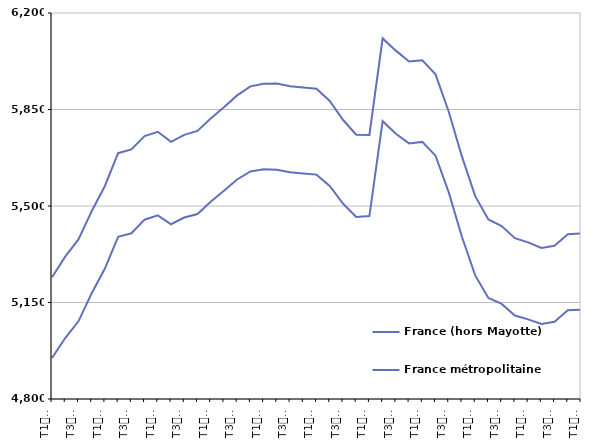
| Category | France (hors Mayotte) | France métropolitaine |
|---|---|---|
| T1
2014 | 5241.8 | 4948.5 |
| T2
2014 | 5316.2 | 5021 |
| T3
2014 | 5378.7 | 5081.8 |
| T4
2014 | 5481.1 | 5183.3 |
| T1
2015 | 5572.6 | 5273 |
| T2
2015 | 5691.5 | 5387.9 |
| T3
2015 | 5705 | 5401 |
| T4
2015 | 5753.7 | 5450.4 |
| T1
2016 | 5769.2 | 5465.9 |
| T2
2016 | 5732.9 | 5433.8 |
| T3
2016 | 5758.1 | 5458.2 |
| T4
2016 | 5772.4 | 5471 |
| T1
2017 | 5817.6 | 5515.2 |
| T2
2017 | 5857.9 | 5555.5 |
| T3
2017 | 5901.1 | 5596.3 |
| T4
2017 | 5933.9 | 5625.3 |
| T1
2018 | 5943.3 | 5632.9 |
| T2
2018 | 5943.9 | 5631.3 |
| T3
2018 | 5934.5 | 5622.1 |
| T4
2018 | 5930 | 5618.1 |
| T1
2019 | 5925.6 | 5613.8 |
| T2
2019 | 5880.8 | 5572.9 |
| T3
2019 | 5812.7 | 5508.8 |
| T4
2019 | 5758.4 | 5459.9 |
| T1
2020 | 5757.7 | 5463.3 |
| T2
2020 | 6107.9 | 5807.7 |
| T3
2020 | 6063.5 | 5762.2 |
| T4
2020 | 6023.9 | 5727 |
| T1
2021 | 6028.7 | 5732.5 |
| T2
2021 | 5977.4 | 5682.5 |
| T3
2021 | 5841.8 | 5549.2 |
| T4
2021 | 5678.9 | 5387.6 |
| T1
2022 | 5535.7 | 5248.2 |
| T2
2022 | 5451.2 | 5166.6 |
| T3
2022 | 5427.5 | 5144.9 |
| T4
2022 | 5383.5 | 5102.8 |
| T1
2023 | 5368.2 | 5088.9 |
| T2
2023 | 5347.9 | 5072 |
| T3
2023 | 5355.8 | 5080.2 |
| T4
2023 | 5397.9 | 5121.7 |
| T1
2024 | 5400.5 | 5124.3 |